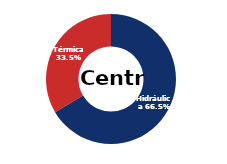
| Category | Centro |
|---|---|
| Eólica | 0 |
| Hidráulica | 2693.256 |
| Solar | 0.006 |
| Térmica | 1357.788 |